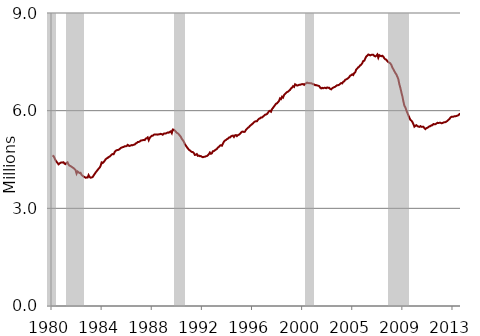
| Category | Series 0 |
|---|---|
| 1980.0 | 4.625 |
| 1980.0 | 4.605 |
| 1980.0 | 4.548 |
| 1980.0 | 4.473 |
| 1980.0 | 4.434 |
| 1980.0 | 4.395 |
| 1980.0 | 4.351 |
| 1980.0 | 4.377 |
| 1980.0 | 4.401 |
| 1980.0 | 4.411 |
| 1980.0 | 4.409 |
| 1980.0 | 4.415 |
| 1981.0 | 4.374 |
| 1981.0 | 4.357 |
| 1981.0 | 4.396 |
| 1981.0 | 4.414 |
| 1981.0 | 4.343 |
| 1981.0 | 4.311 |
| 1981.0 | 4.299 |
| 1981.0 | 4.278 |
| 1981.0 | 4.254 |
| 1981.0 | 4.238 |
| 1981.0 | 4.209 |
| 1981.0 | 4.177 |
| 1982.0 | 4.069 |
| 1982.0 | 4.131 |
| 1982.0 | 4.108 |
| 1982.0 | 4.083 |
| 1982.0 | 4.092 |
| 1982.0 | 4.03 |
| 1982.0 | 4.001 |
| 1982.0 | 3.977 |
| 1982.0 | 3.962 |
| 1982.0 | 3.94 |
| 1982.0 | 3.947 |
| 1982.0 | 3.948 |
| 1983.0 | 4.021 |
| 1983.0 | 3.964 |
| 1983.0 | 3.942 |
| 1983.0 | 3.948 |
| 1983.0 | 3.96 |
| 1983.0 | 4.006 |
| 1983.0 | 4.055 |
| 1983.0 | 4.1 |
| 1983.0 | 4.138 |
| 1983.0 | 4.178 |
| 1983.0 | 4.217 |
| 1983.0 | 4.248 |
| 1984.0 | 4.305 |
| 1984.0 | 4.41 |
| 1984.0 | 4.393 |
| 1984.0 | 4.423 |
| 1984.0 | 4.456 |
| 1984.0 | 4.507 |
| 1984.0 | 4.534 |
| 1984.0 | 4.547 |
| 1984.0 | 4.576 |
| 1984.0 | 4.59 |
| 1984.0 | 4.617 |
| 1984.0 | 4.652 |
| 1985.0 | 4.668 |
| 1985.0 | 4.662 |
| 1985.0 | 4.73 |
| 1985.0 | 4.764 |
| 1985.0 | 4.787 |
| 1985.0 | 4.789 |
| 1985.0 | 4.799 |
| 1985.0 | 4.823 |
| 1985.0 | 4.852 |
| 1985.0 | 4.868 |
| 1985.0 | 4.879 |
| 1985.0 | 4.887 |
| 1986.0 | 4.908 |
| 1986.0 | 4.904 |
| 1986.0 | 4.914 |
| 1986.0 | 4.95 |
| 1986.0 | 4.924 |
| 1986.0 | 4.917 |
| 1986.0 | 4.93 |
| 1986.0 | 4.943 |
| 1986.0 | 4.939 |
| 1986.0 | 4.954 |
| 1986.0 | 4.96 |
| 1986.0 | 4.993 |
| 1987.0 | 5.007 |
| 1987.0 | 5.038 |
| 1987.0 | 5.039 |
| 1987.0 | 5.053 |
| 1987.0 | 5.08 |
| 1987.0 | 5.086 |
| 1987.0 | 5.092 |
| 1987.0 | 5.102 |
| 1987.0 | 5.096 |
| 1987.0 | 5.142 |
| 1987.0 | 5.152 |
| 1987.0 | 5.18 |
| 1988.0 | 5.094 |
| 1988.0 | 5.162 |
| 1988.0 | 5.201 |
| 1988.0 | 5.227 |
| 1988.0 | 5.228 |
| 1988.0 | 5.261 |
| 1988.0 | 5.27 |
| 1988.0 | 5.268 |
| 1988.0 | 5.27 |
| 1988.0 | 5.262 |
| 1988.0 | 5.273 |
| 1988.0 | 5.277 |
| 1989.0 | 5.289 |
| 1989.0 | 5.278 |
| 1989.0 | 5.26 |
| 1989.0 | 5.295 |
| 1989.0 | 5.299 |
| 1989.0 | 5.298 |
| 1989.0 | 5.317 |
| 1989.0 | 5.33 |
| 1989.0 | 5.323 |
| 1989.0 | 5.347 |
| 1989.0 | 5.364 |
| 1989.0 | 5.309 |
| 1990.0 | 5.422 |
| 1990.0 | 5.416 |
| 1990.0 | 5.392 |
| 1990.0 | 5.355 |
| 1990.0 | 5.321 |
| 1990.0 | 5.303 |
| 1990.0 | 5.274 |
| 1990.0 | 5.234 |
| 1990.0 | 5.197 |
| 1990.0 | 5.134 |
| 1990.0 | 5.095 |
| 1990.0 | 5.047 |
| 1991.0 | 4.972 |
| 1991.0 | 4.929 |
| 1991.0 | 4.881 |
| 1991.0 | 4.842 |
| 1991.0 | 4.8 |
| 1991.0 | 4.782 |
| 1991.0 | 4.752 |
| 1991.0 | 4.733 |
| 1991.0 | 4.728 |
| 1991.0 | 4.698 |
| 1991.0 | 4.64 |
| 1991.0 | 4.647 |
| 1992.0 | 4.667 |
| 1992.0 | 4.612 |
| 1992.0 | 4.621 |
| 1992.0 | 4.603 |
| 1992.0 | 4.605 |
| 1992.0 | 4.584 |
| 1992.0 | 4.57 |
| 1992.0 | 4.581 |
| 1992.0 | 4.584 |
| 1992.0 | 4.6 |
| 1992.0 | 4.606 |
| 1992.0 | 4.63 |
| 1993.0 | 4.664 |
| 1993.0 | 4.714 |
| 1993.0 | 4.676 |
| 1993.0 | 4.69 |
| 1993.0 | 4.753 |
| 1993.0 | 4.76 |
| 1993.0 | 4.783 |
| 1993.0 | 4.806 |
| 1993.0 | 4.823 |
| 1993.0 | 4.868 |
| 1993.0 | 4.887 |
| 1993.0 | 4.925 |
| 1994.0 | 4.94 |
| 1994.0 | 4.923 |
| 1994.0 | 4.99 |
| 1994.0 | 5.047 |
| 1994.0 | 5.084 |
| 1994.0 | 5.097 |
| 1994.0 | 5.125 |
| 1994.0 | 5.139 |
| 1994.0 | 5.175 |
| 1994.0 | 5.177 |
| 1994.0 | 5.21 |
| 1994.0 | 5.226 |
| 1995.0 | 5.234 |
| 1995.0 | 5.192 |
| 1995.0 | 5.242 |
| 1995.0 | 5.252 |
| 1995.0 | 5.22 |
| 1995.0 | 5.25 |
| 1995.0 | 5.262 |
| 1995.0 | 5.286 |
| 1995.0 | 5.324 |
| 1995.0 | 5.353 |
| 1995.0 | 5.358 |
| 1995.0 | 5.344 |
| 1996.0 | 5.355 |
| 1996.0 | 5.415 |
| 1996.0 | 5.446 |
| 1996.0 | 5.474 |
| 1996.0 | 5.498 |
| 1996.0 | 5.534 |
| 1996.0 | 5.557 |
| 1996.0 | 5.586 |
| 1996.0 | 5.61 |
| 1996.0 | 5.643 |
| 1996.0 | 5.668 |
| 1996.0 | 5.675 |
| 1997.0 | 5.675 |
| 1997.0 | 5.722 |
| 1997.0 | 5.751 |
| 1997.0 | 5.764 |
| 1997.0 | 5.793 |
| 1997.0 | 5.793 |
| 1997.0 | 5.817 |
| 1997.0 | 5.846 |
| 1997.0 | 5.874 |
| 1997.0 | 5.883 |
| 1997.0 | 5.899 |
| 1997.0 | 5.938 |
| 1998.0 | 5.983 |
| 1998.0 | 5.997 |
| 1998.0 | 5.969 |
| 1998.0 | 6.049 |
| 1998.0 | 6.087 |
| 1998.0 | 6.13 |
| 1998.0 | 6.172 |
| 1998.0 | 6.215 |
| 1998.0 | 6.225 |
| 1998.0 | 6.262 |
| 1998.0 | 6.301 |
| 1998.0 | 6.378 |
| 1999.0 | 6.357 |
| 1999.0 | 6.429 |
| 1999.0 | 6.402 |
| 1999.0 | 6.48 |
| 1999.0 | 6.516 |
| 1999.0 | 6.547 |
| 1999.0 | 6.571 |
| 1999.0 | 6.586 |
| 1999.0 | 6.613 |
| 1999.0 | 6.64 |
| 1999.0 | 6.687 |
| 1999.0 | 6.709 |
| 2000.0 | 6.752 |
| 2000.0 | 6.73 |
| 2000.0 | 6.811 |
| 2000.0 | 6.794 |
| 2000.0 | 6.77 |
| 2000.0 | 6.778 |
| 2000.0 | 6.794 |
| 2000.0 | 6.796 |
| 2000.0 | 6.807 |
| 2000.0 | 6.814 |
| 2000.0 | 6.817 |
| 2000.0 | 6.792 |
| 2001.0 | 6.824 |
| 2001.0 | 6.841 |
| 2001.0 | 6.862 |
| 2001.0 | 6.844 |
| 2001.0 | 6.849 |
| 2001.0 | 6.84 |
| 2001.0 | 6.845 |
| 2001.0 | 6.827 |
| 2001.0 | 6.813 |
| 2001.0 | 6.804 |
| 2001.0 | 6.784 |
| 2001.0 | 6.785 |
| 2002.0 | 6.775 |
| 2002.0 | 6.766 |
| 2002.0 | 6.755 |
| 2002.0 | 6.71 |
| 2002.0 | 6.684 |
| 2002.0 | 6.701 |
| 2002.0 | 6.688 |
| 2002.0 | 6.701 |
| 2002.0 | 6.702 |
| 2002.0 | 6.689 |
| 2002.0 | 6.713 |
| 2002.0 | 6.7 |
| 2003.0 | 6.704 |
| 2003.0 | 6.667 |
| 2003.0 | 6.654 |
| 2003.0 | 6.689 |
| 2003.0 | 6.706 |
| 2003.0 | 6.723 |
| 2003.0 | 6.735 |
| 2003.0 | 6.76 |
| 2003.0 | 6.783 |
| 2003.0 | 6.784 |
| 2003.0 | 6.796 |
| 2003.0 | 6.827 |
| 2004.0 | 6.848 |
| 2004.0 | 6.838 |
| 2004.0 | 6.887 |
| 2004.0 | 6.901 |
| 2004.0 | 6.948 |
| 2004.0 | 6.962 |
| 2004.0 | 6.977 |
| 2004.0 | 7.003 |
| 2004.0 | 7.029 |
| 2004.0 | 7.077 |
| 2004.0 | 7.091 |
| 2004.0 | 7.117 |
| 2005.0 | 7.095 |
| 2005.0 | 7.153 |
| 2005.0 | 7.181 |
| 2005.0 | 7.266 |
| 2005.0 | 7.294 |
| 2005.0 | 7.333 |
| 2005.0 | 7.353 |
| 2005.0 | 7.394 |
| 2005.0 | 7.415 |
| 2005.0 | 7.46 |
| 2005.0 | 7.524 |
| 2005.0 | 7.533 |
| 2006.0 | 7.601 |
| 2006.0 | 7.664 |
| 2006.0 | 7.689 |
| 2006.0 | 7.726 |
| 2006.0 | 7.713 |
| 2006.0 | 7.699 |
| 2006.0 | 7.712 |
| 2006.0 | 7.72 |
| 2006.0 | 7.718 |
| 2006.0 | 7.682 |
| 2006.0 | 7.666 |
| 2006.0 | 7.685 |
| 2007.0 | 7.725 |
| 2007.0 | 7.626 |
| 2007.0 | 7.706 |
| 2007.0 | 7.686 |
| 2007.0 | 7.673 |
| 2007.0 | 7.687 |
| 2007.0 | 7.66 |
| 2007.0 | 7.61 |
| 2007.0 | 7.577 |
| 2007.0 | 7.565 |
| 2007.0 | 7.523 |
| 2007.0 | 7.49 |
| 2008.0 | 7.476 |
| 2008.0 | 7.453 |
| 2008.0 | 7.406 |
| 2008.0 | 7.327 |
| 2008.0 | 7.274 |
| 2008.0 | 7.213 |
| 2008.0 | 7.16 |
| 2008.0 | 7.114 |
| 2008.0 | 7.044 |
| 2008.0 | 6.967 |
| 2008.0 | 6.813 |
| 2008.0 | 6.701 |
| 2009.0 | 6.567 |
| 2009.0 | 6.446 |
| 2009.0 | 6.291 |
| 2009.0 | 6.154 |
| 2009.0 | 6.1 |
| 2009.0 | 6.01 |
| 2009.0 | 5.932 |
| 2009.0 | 5.855 |
| 2009.0 | 5.787 |
| 2009.0 | 5.716 |
| 2009.0 | 5.696 |
| 2009.0 | 5.654 |
| 2010.0 | 5.587 |
| 2010.0 | 5.508 |
| 2010.0 | 5.536 |
| 2010.0 | 5.555 |
| 2010.0 | 5.524 |
| 2010.0 | 5.512 |
| 2010.0 | 5.502 |
| 2010.0 | 5.525 |
| 2010.0 | 5.503 |
| 2010.0 | 5.507 |
| 2010.0 | 5.504 |
| 2010.0 | 5.462 |
| 2011.0 | 5.432 |
| 2011.0 | 5.464 |
| 2011.0 | 5.475 |
| 2011.0 | 5.496 |
| 2011.0 | 5.52 |
| 2011.0 | 5.524 |
| 2011.0 | 5.551 |
| 2011.0 | 5.553 |
| 2011.0 | 5.59 |
| 2011.0 | 5.584 |
| 2011.0 | 5.585 |
| 2011.0 | 5.606 |
| 2012.0 | 5.627 |
| 2012.0 | 5.622 |
| 2012.0 | 5.627 |
| 2012.0 | 5.63 |
| 2012.0 | 5.613 |
| 2012.0 | 5.62 |
| 2012.0 | 5.635 |
| 2012.0 | 5.647 |
| 2012.0 | 5.648 |
| 2012.0 | 5.666 |
| 2012.0 | 5.687 |
| 2012.0 | 5.72 |
| 2013.0 | 5.743 |
| 2013.0 | 5.789 |
| 2013.0 | 5.813 |
| 2013.0 | 5.811 |
| 2013.0 | 5.816 |
| 2013.0 | 5.829 |
| 2013.0 | 5.83 |
| 2013.0 | 5.836 |
| 2013.0 | 5.849 |
| 2013.0 | 5.864 |
| 2013.0 | 5.896 |
| 2013.0 | 5.876 |